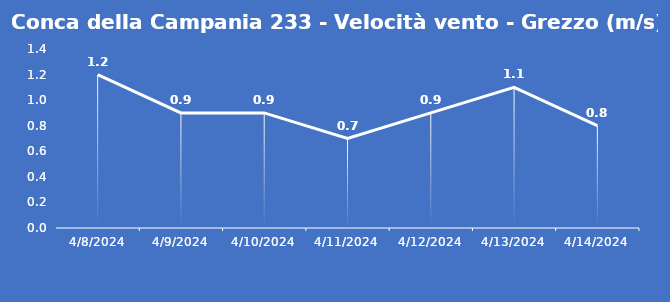
| Category | Conca della Campania 233 - Velocità vento - Grezzo (m/s) |
|---|---|
| 4/8/24 | 1.2 |
| 4/9/24 | 0.9 |
| 4/10/24 | 0.9 |
| 4/11/24 | 0.7 |
| 4/12/24 | 0.9 |
| 4/13/24 | 1.1 |
| 4/14/24 | 0.8 |